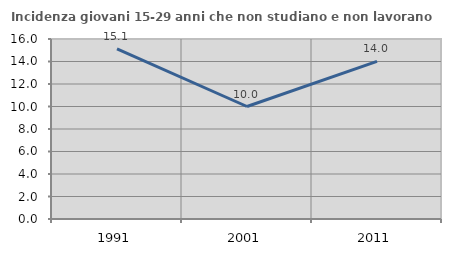
| Category | Incidenza giovani 15-29 anni che non studiano e non lavorano  |
|---|---|
| 1991.0 | 15.127 |
| 2001.0 | 10 |
| 2011.0 | 14.014 |